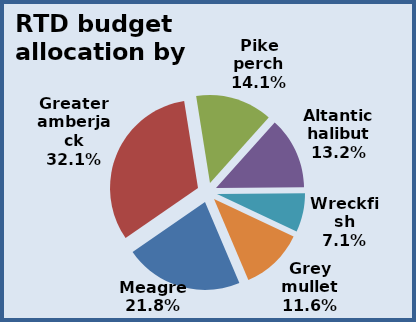
| Category | Series 0 |
|---|---|
| Meagre | 0.218 |
| Greater amberjack | 0.321 |
| Pike perch | 0.141 |
| Altantic halibut | 0.132 |
| Wreckfish | 0.071 |
| Grey mullet | 0.116 |